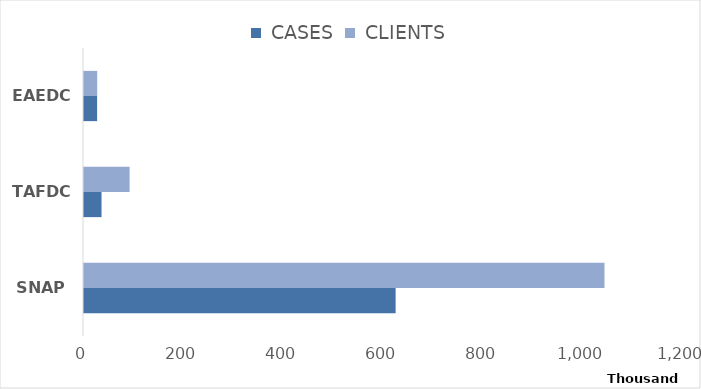
| Category |  CASES |  CLIENTS |
|---|---|---|
| SNAP | 623225 | 1041011 |
| TAFDC | 35045 | 91208 |
| EAEDC | 26229 | 26389 |